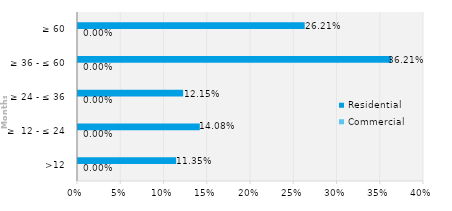
| Category | Commercial | Residential |
|---|---|---|
| >12 | 0 | 0.113 |
| ≥  12 - ≤ 24 | 0 | 0.141 |
| ≥ 24 - ≤ 36 | 0 | 0.122 |
| ≥ 36 - ≤ 60 | 0 | 0.362 |
| ≥ 60 | 0 | 0.262 |